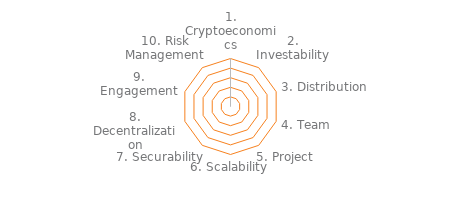
| Category | Series 0 |
|---|---|
| 1. Cryptoeconomics | 5 |
| 2. Investability | 0 |
| 3. Distribution | 0 |
| 4. Team | 0 |
| 5. Project | 0 |
| 6. Scalability | 0 |
| 7. Securability | 0 |
| 8. Decentralization | 0 |
| 9. Engagement | 0 |
| 10. Risk Management | 0 |